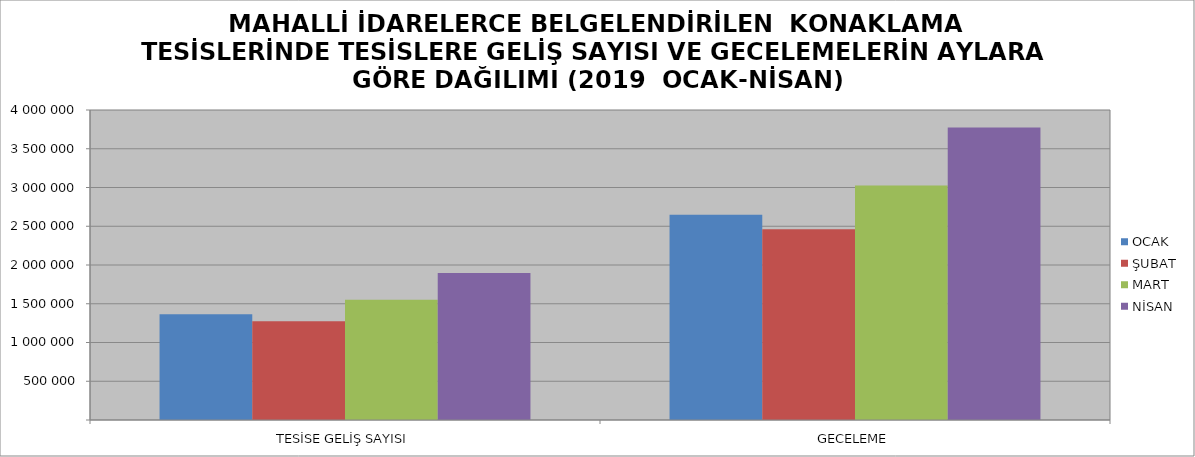
| Category | OCAK | ŞUBAT | MART | NİSAN |
|---|---|---|---|---|
| TESİSE GELİŞ SAYISI | 1363187 | 1273727 | 1552518 | 1898202 |
| GECELEME | 2649437 | 2462023 | 3024704 | 3772615 |